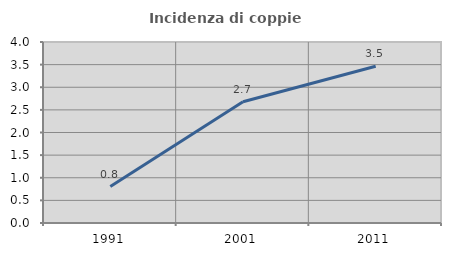
| Category | Incidenza di coppie miste |
|---|---|
| 1991.0 | 0.804 |
| 2001.0 | 2.679 |
| 2011.0 | 3.465 |